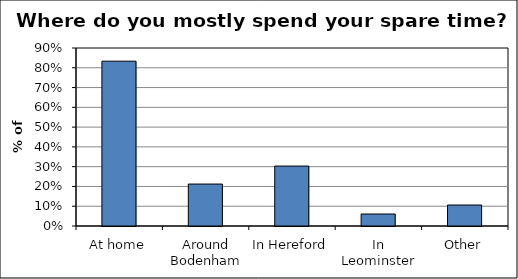
| Category | Series 0 |
|---|---|
| At home | 0.833 |
| Around Bodenham | 0.212 |
| In Hereford | 0.303 |
| In Leominster | 0.061 |
| Other | 0.106 |